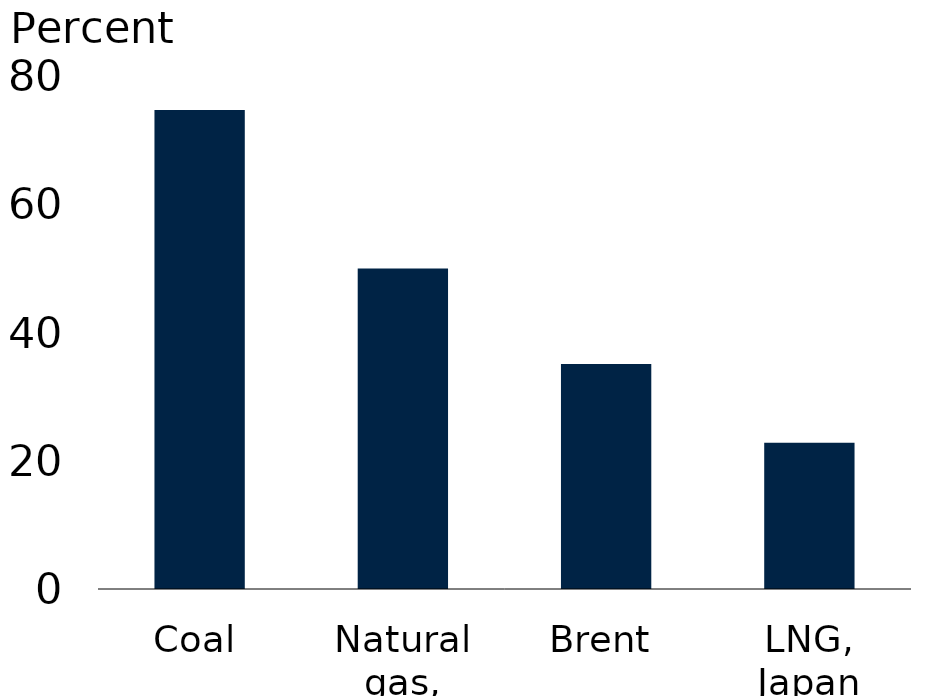
| Category | Series 0 |
|---|---|
| Coal | 74.7 |
| Natural gas, Europe | 50 |
| Brent | 35.1 |
| LNG, Japan | 22.8 |